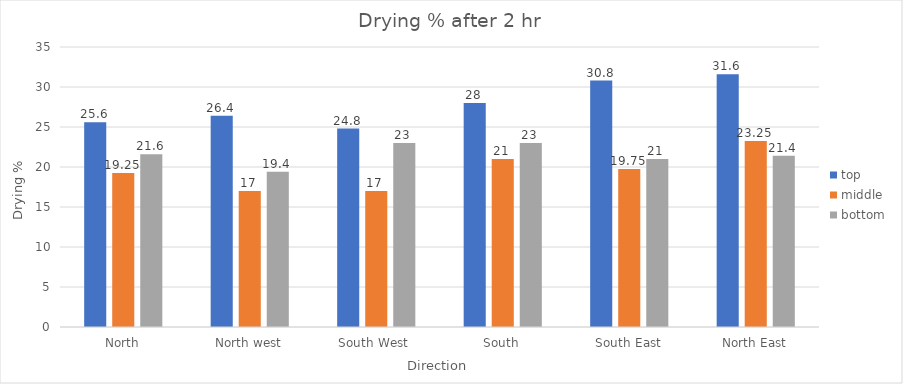
| Category | top | middle | bottom |
|---|---|---|---|
| North | 25.6 | 19.25 | 21.6 |
| North west | 26.4 | 17 | 19.4 |
| South West  | 24.8 | 17 | 23 |
| South | 28 | 21 | 23 |
| South East | 30.8 | 19.75 | 21 |
| North East | 31.6 | 23.25 | 21.4 |